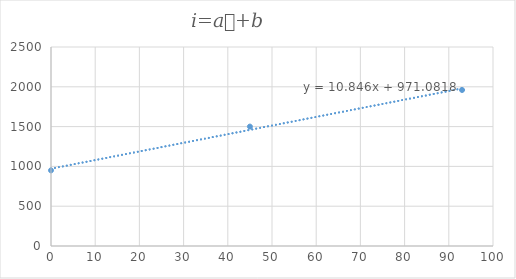
| Category | Series 0 |
|---|---|
| 0.0 | 950 |
| 45.0 | 1500 |
| 93.0 | 1960 |